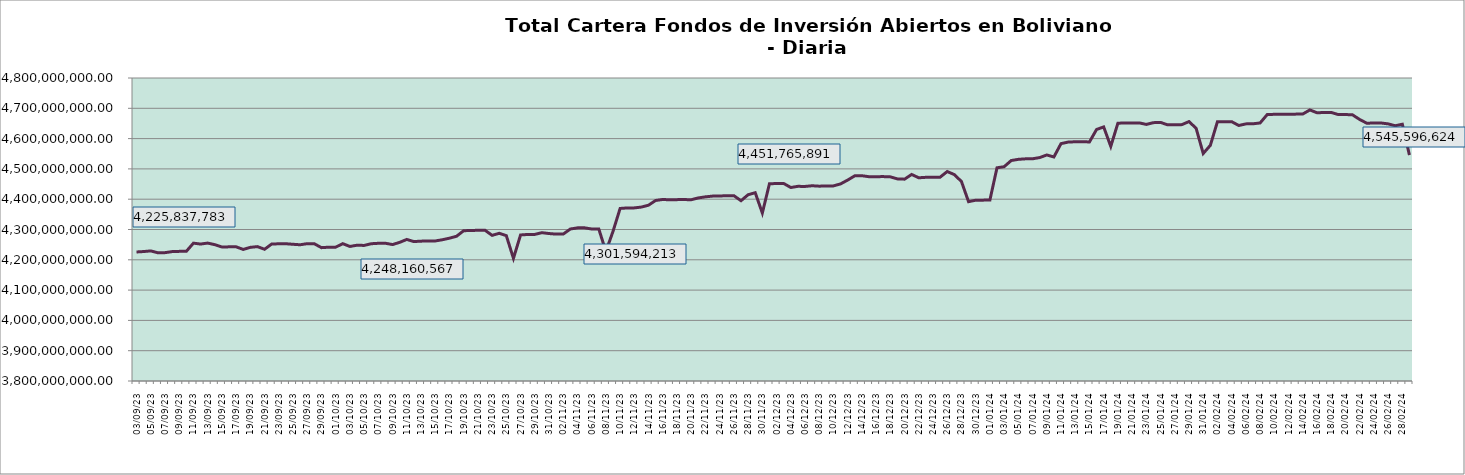
| Category | Cartera |
|---|---|
| 2023-09-03 | 4225837782.96 |
| 2023-09-04 | 4227240249.25 |
| 2023-09-05 | 4229369887.25 |
| 2023-09-06 | 4223134189.63 |
| 2023-09-07 | 4223572973.05 |
| 2023-09-08 | 4227031396.42 |
| 2023-09-09 | 4227828115.47 |
| 2023-09-10 | 4227998265.07 |
| 2023-09-11 | 4254934059.22 |
| 2023-09-12 | 4251997659.89 |
| 2023-09-13 | 4255168121.96 |
| 2023-09-14 | 4249945741.98 |
| 2023-09-15 | 4242376110.43 |
| 2023-09-16 | 4242697978.39 |
| 2023-09-17 | 4242873084.15 |
| 2023-09-18 | 4234198831.63 |
| 2023-09-19 | 4241122644.1 |
| 2023-09-20 | 4243478115.99 |
| 2023-09-21 | 4234723410.56 |
| 2023-09-22 | 4251990813.6 |
| 2023-09-23 | 4252824802.38 |
| 2023-09-24 | 4253001324.64 |
| 2023-09-25 | 4251195146.31 |
| 2023-09-26 | 4249614122.72 |
| 2023-09-27 | 4253275776.12 |
| 2023-09-28 | 4252923490.36 |
| 2023-09-29 | 4240084259.46 |
| 2023-09-30 | 4241550326.26 |
| 2023-10-01 | 4241740015.55 |
| 2023-10-02 | 4253251683.8 |
| 2023-10-03 | 4244025028.9 |
| 2023-10-04 | 4248160567.43 |
| 2023-10-05 | 4247416448.27 |
| 2023-10-06 | 4253046297.14 |
| 2023-10-07 | 4254432875.57 |
| 2023-10-08 | 4254607816.99 |
| 2023-10-09 | 4250276298.22 |
| 2023-10-10 | 4257566355.66 |
| 2023-10-11 | 4267208349.57 |
| 2023-10-12 | 4260077291.27 |
| 2023-10-13 | 4261575395.82 |
| 2023-10-14 | 4261984257.98 |
| 2023-10-15 | 4262148121.72 |
| 2023-10-16 | 4266161012.53 |
| 2023-10-17 | 4271338439.98 |
| 2023-10-18 | 4277700920.1 |
| 2023-10-19 | 4295989286.49 |
| 2023-10-20 | 4296752483 |
| 2023-10-21 | 4297352768.14 |
| 2023-10-22 | 4297515758.63 |
| 2023-10-23 | 4280664793.45 |
| 2023-10-24 | 4287408973.45 |
| 2023-10-25 | 4279614406.75 |
| 2023-10-26 | 4204785195.17 |
| 2023-10-27 | 4281961612.99 |
| 2023-10-28 | 4283622242.24 |
| 2023-10-29 | 4283803811.07 |
| 2023-10-30 | 4289506540.61 |
| 2023-10-31 | 4286689692.19 |
| 2023-11-01 | 4284761280.38 |
| 2023-11-02 | 4284889038.22 |
| 2023-11-03 | 4301594212.59 |
| 2023-11-04 | 4305374107 |
| 2023-11-05 | 4305557747.44 |
| 2023-11-06 | 4301691364.38 |
| 2023-11-07 | 4301975072.92 |
| 2023-11-08 | 4227421817.51 |
| 2023-11-09 | 4293799971.52 |
| 2023-11-10 | 4369428468.75 |
| 2023-11-11 | 4371160358 |
| 2023-11-12 | 4371321552.44 |
| 2023-11-13 | 4374036488.01 |
| 2023-11-14 | 4380249168.59 |
| 2023-11-15 | 4395825155.76 |
| 2023-11-16 | 4399190209.36 |
| 2023-11-17 | 4397887887.33 |
| 2023-11-18 | 4398579844.36 |
| 2023-11-19 | 4398759308.67 |
| 2023-11-20 | 4398296510.09 |
| 2023-11-21 | 4404236003.53 |
| 2023-11-22 | 4407786452.76 |
| 2023-11-23 | 4410199675.83 |
| 2023-11-24 | 4410645721.9 |
| 2023-11-25 | 4411427855.31 |
| 2023-11-26 | 4411608567.59 |
| 2023-11-27 | 4395009258.51 |
| 2023-11-28 | 4414758140.09 |
| 2023-11-29 | 4421448911.02 |
| 2023-11-30 | 4354375325.07 |
| 2023-12-01 | 4450921375.8 |
| 2023-12-02 | 4451765891.18 |
| 2023-12-03 | 4451960745.03 |
| 2023-12-04 | 4438628762.86 |
| 2023-12-05 | 4442441869.92 |
| 2023-12-06 | 4442103984.82 |
| 2023-12-07 | 4444373478.95 |
| 2023-12-08 | 4442992657.54 |
| 2023-12-09 | 4443749468.74 |
| 2023-12-10 | 4443952228.26 |
| 2023-12-11 | 4450460471.99 |
| 2023-12-12 | 4463148794.27 |
| 2023-12-13 | 4477168995.04 |
| 2023-12-14 | 4477485456.63 |
| 2023-12-15 | 4474197441.85 |
| 2023-12-16 | 4474368223.63 |
| 2023-12-17 | 4474578959.2 |
| 2023-12-18 | 4473710709.35 |
| 2023-12-19 | 4466995308.19 |
| 2023-12-20 | 4466150193.08 |
| 2023-12-21 | 4481596686.48 |
| 2023-12-22 | 4470675674.26 |
| 2023-12-23 | 4472212249.11 |
| 2023-12-24 | 4472423094.28 |
| 2023-12-25 | 4472637527.95 |
| 2023-12-26 | 4491312389.91 |
| 2023-12-27 | 4481184198.47 |
| 2023-12-28 | 4458449001.93 |
| 2023-12-29 | 4391809437.69 |
| 2023-12-30 | 4396686145.28 |
| 2023-12-31 | 4396909800.84 |
| 2024-01-01 | 4397094688.27 |
| 2024-01-02 | 4503689125.25 |
| 2024-01-03 | 4507204789.14 |
| 2024-01-04 | 4527583774.87 |
| 2024-01-05 | 4531577164.52 |
| 2024-01-06 | 4533169857.12 |
| 2024-01-07 | 4533378412.66 |
| 2024-01-08 | 4537365783.81 |
| 2024-01-09 | 4545988866.04 |
| 2024-01-10 | 4539378051.72 |
| 2024-01-11 | 4583359893.41 |
| 2024-01-12 | 4588540598.04 |
| 2024-01-13 | 4589539655.95 |
| 2024-01-14 | 4589749702.61 |
| 2024-01-15 | 4588925556.92 |
| 2024-01-16 | 4630097233.87 |
| 2024-01-17 | 4638514769.31 |
| 2024-01-18 | 4574256747.36 |
| 2024-01-19 | 4650846364.78 |
| 2024-01-20 | 4651477250.49 |
| 2024-01-21 | 4651686748.85 |
| 2024-01-22 | 4651863757.22 |
| 2024-01-23 | 4646774540.97 |
| 2024-01-24 | 4652618964.58 |
| 2024-01-25 | 4653398203.04 |
| 2024-01-26 | 4645439951.76 |
| 2024-01-27 | 4645914265.38 |
| 2024-01-28 | 4646125784.39 |
| 2024-01-29 | 4656158639.22 |
| 2024-01-30 | 4634079821.17 |
| 2024-01-31 | 4550823737.79 |
| 2024-02-01 | 4577753068.69 |
| 2024-02-02 | 4655816874.88 |
| 2024-02-03 | 4655636810.41 |
| 2024-02-04 | 4655868796.2 |
| 2024-02-05 | 4643220438.65 |
| 2024-02-06 | 4648572085.91 |
| 2024-02-07 | 4648911543.35 |
| 2024-02-08 | 4651630701.14 |
| 2024-02-09 | 4679336430.37 |
| 2024-02-10 | 4680119411.04 |
| 2024-02-11 | 4680327622.91 |
| 2024-02-12 | 4680566695.27 |
| 2024-02-13 | 4680775159.47 |
| 2024-02-14 | 4681153518.28 |
| 2024-02-15 | 4694557106.72 |
| 2024-02-16 | 4685291556.87 |
| 2024-02-17 | 4686130644.38 |
| 2024-02-18 | 4686343353.41 |
| 2024-02-19 | 4679236370.83 |
| 2024-02-20 | 4679469951.73 |
| 2024-02-21 | 4678373503.51 |
| 2024-02-22 | 4663081609.43 |
| 2024-02-23 | 4650843077.65 |
| 2024-02-24 | 4651323281.84 |
| 2024-02-25 | 4651533431.18 |
| 2024-02-26 | 4648597101.49 |
| 2024-02-27 | 4642441838.34 |
| 2024-02-28 | 4647416174.08 |
| 2024-02-29 | 4545596624.17 |